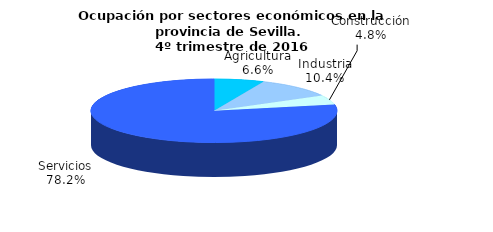
| Category | Series 0 |
|---|---|
| Agricultura | 44.5 |
| Industria | 70.6 |
| Construcción | 32.7 |
| Servicios | 530 |